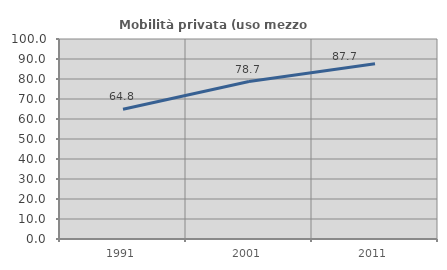
| Category | Mobilità privata (uso mezzo privato) |
|---|---|
| 1991.0 | 64.846 |
| 2001.0 | 78.715 |
| 2011.0 | 87.664 |